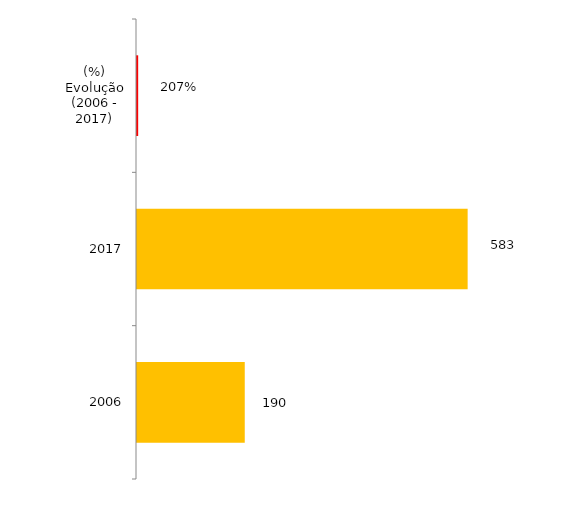
| Category | Docente - Efetivo |
|---|---|
| 2006 | 190 |
| 2017 | 583 |
| (%) Evolução (2006 - 2017) | 2.068 |